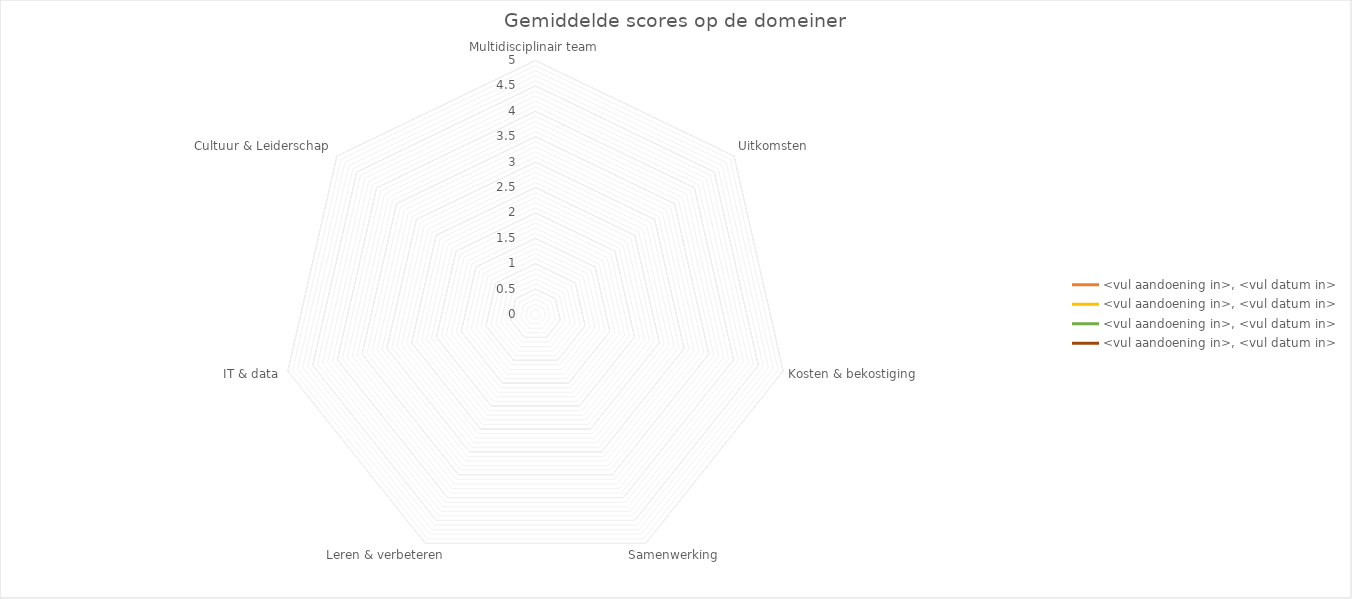
| Category | <vul aandoening in>, <vul datum in> |
|---|---|
| Multidisciplinair team | 0 |
| Uitkomsten | 0 |
| Kosten & bekostiging | 0 |
| Samenwerking | 0 |
| Leren & verbeteren | 0 |
| IT & data | 0 |
| Cultuur & Leiderschap | 0 |